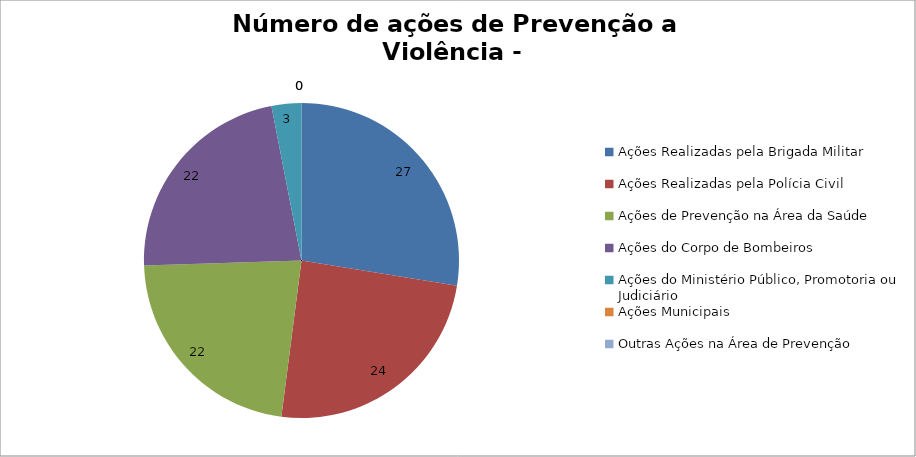
| Category | Número de Ações |
|---|---|
| Ações Realizadas pela Brigada Militar | 27 |
| Ações Realizadas pela Polícia Civil | 24 |
| Ações de Prevenção na Área da Saúde | 22 |
| Ações do Corpo de Bombeiros | 22 |
| Ações do Ministério Público, Promotoria ou Judiciário | 3 |
| Ações Municipais | 0 |
| Outras Ações na Área de Prevenção | 0 |